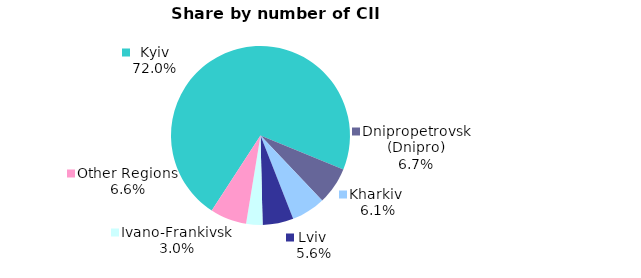
| Category | Series 0 |
|---|---|
| Kyiv | 0.72 |
| Dnipropetrovsk (Dnipro) | 0.067 |
| Kharkiv  | 0.061 |
| Lviv  | 0.056 |
| Ivano-Frankivsk | 0.03 |
| Other Regions | 0.066 |